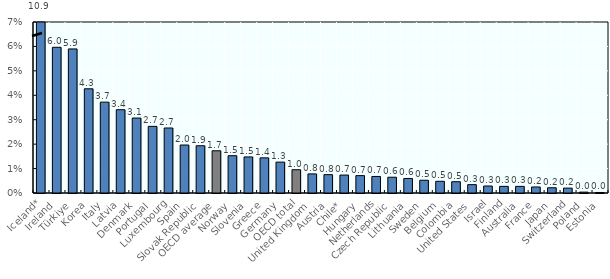
| Category | Series 0 |
|---|---|
| Iceland* | 0.109 |
| Ireland | 0.06 |
| Türkiye | 0.059 |
| Korea | 0.043 |
| Italy | 0.037 |
| Latvia | 0.034 |
| Denmark | 0.031 |
| Portugal | 0.027 |
| Luxembourg | 0.027 |
| Spain | 0.02 |
| Slovak Republic | 0.019 |
| OECD average | 0.017 |
| Norway | 0.015 |
| Slovenia | 0.015 |
| Greece | 0.014 |
| Germany | 0.013 |
| OECD total | 0.01 |
| United Kingdom | 0.008 |
| Austria | 0.008 |
| Chile* | 0.007 |
| Hungary | 0.007 |
| Netherlands | 0.007 |
| Czech Republic | 0.006 |
| Lithuania | 0.006 |
| Sweden | 0.005 |
| Belgium | 0.005 |
| Colombia | 0.005 |
| United States | 0.003 |
| Israel | 0.003 |
| Finland | 0.003 |
| Australia | 0.003 |
| France | 0.002 |
| Japan | 0.002 |
| Switzerland | 0.002 |
| Poland | 0 |
| Estonia | 0 |